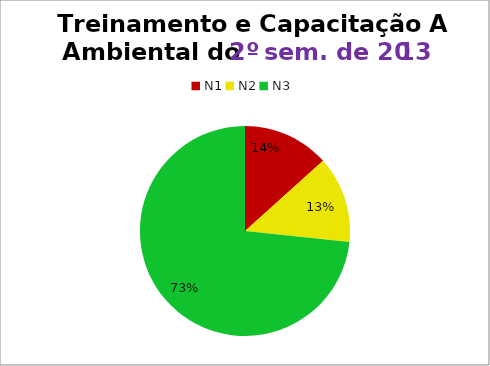
| Category | 2º/13 |
|---|---|
| N1 | 4 |
| N2 | 4 |
| N3 | 22 |